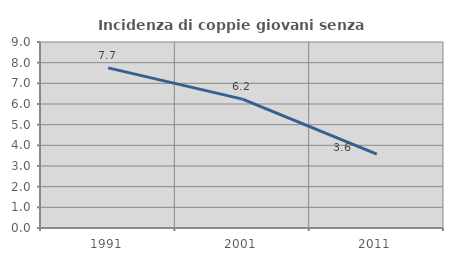
| Category | Incidenza di coppie giovani senza figli |
|---|---|
| 1991.0 | 7.746 |
| 2001.0 | 6.236 |
| 2011.0 | 3.58 |